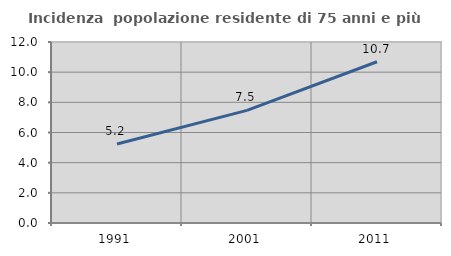
| Category | Incidenza  popolazione residente di 75 anni e più |
|---|---|
| 1991.0 | 5.241 |
| 2001.0 | 7.468 |
| 2011.0 | 10.69 |